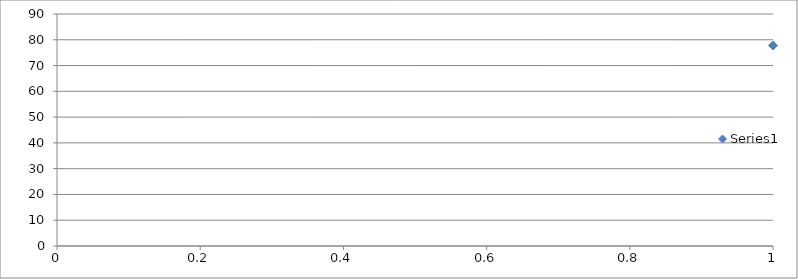
| Category | Series 0 |
|---|---|
| 0 | 77.8 |
| 1 | 30 |
| 2 | 71.8 |
| 3 | 35.6 |
| 4 | 71.1 |
| 5 | 33.3 |
| 6 | 77.5 |
| 7 | 33.8 |
| 8 | 83.6 |
| 9 | 31 |
| 10 | 66 |
| 11 | 28.2 |
| 12 | 68.7 |
| 13 | 16.4 |
| 14 | 65.8 |
| 15 | 35.1 |
| 16 | 81.3 |
| 17 | 33.3 |